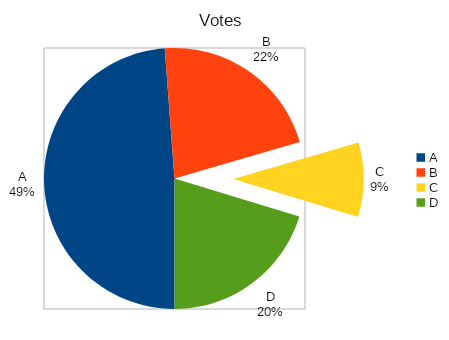
| Category | Votes |
|---|---|
| A | 450 |
| B | 200 |
| C | 85 |
| D | 187 |